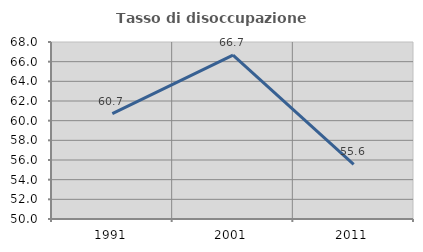
| Category | Tasso di disoccupazione giovanile  |
|---|---|
| 1991.0 | 60.714 |
| 2001.0 | 66.667 |
| 2011.0 | 55.556 |